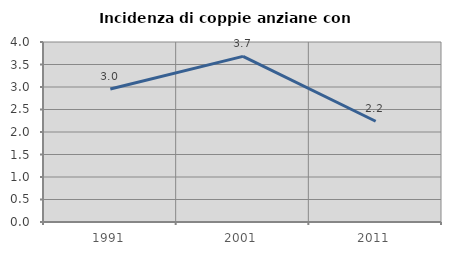
| Category | Incidenza di coppie anziane con figli |
|---|---|
| 1991.0 | 2.956 |
| 2001.0 | 3.681 |
| 2011.0 | 2.239 |